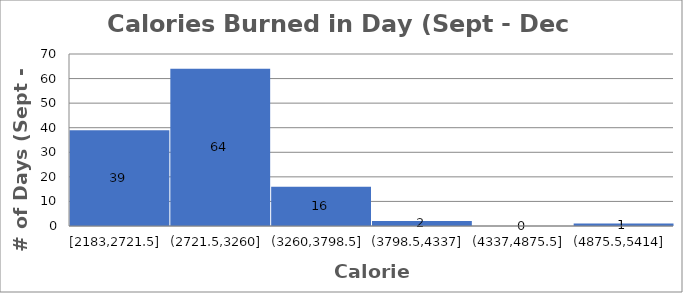
| Category | Sleep Score |
|---|---|
| 9/1/19 | 83 |
| 9/2/19 | 80 |
| 9/3/19 | 76 |
| 9/4/19 | 75 |
| 9/5/19 | 61 |
| 9/6/19 | 84 |
| 9/7/19 | 81 |
| 9/8/19 | 84 |
| 9/9/19 | 78 |
| 9/10/19 | 72 |
| 9/11/19 | 77 |
| 9/12/19 | 70 |
| 9/13/19 | 74 |
| 9/14/19 | 69 |
| 9/15/19 | 56 |
| 9/16/19 | 78 |
| 9/17/19 | 64 |
| 9/18/19 | 72 |
| 9/19/19 | 74 |
| 9/20/19 | 76 |
| 9/21/19 | 81 |
| 9/22/19 | 79 |
| 9/23/19 | 82 |
| 9/24/19 | 79 |
| 9/25/19 | 71 |
| 9/26/19 | 74 |
| 9/27/19 | 68 |
| 9/28/19 | 85 |
| 9/29/19 | 77 |
| 9/30/19 | 81 |
| 10/1/19 | 74 |
| 10/2/19 | 69 |
| 10/3/19 | 77 |
| 10/4/19 | 74 |
| 10/5/19 | 77 |
| 10/6/19 | 79 |
| 10/7/19 | 64 |
| 10/8/19 | 88 |
| 10/9/19 | 81 |
| 10/10/19 | 79 |
| 10/11/19 | 73 |
| 10/12/19 | 73 |
| 10/13/19 | 79 |
| 10/14/19 | 67 |
| 10/15/19 | 79 |
| 10/16/19 | 81 |
| 10/17/19 | 75 |
| 10/18/19 | 64 |
| 10/19/19 | 75 |
| 10/20/19 | 89 |
| 10/21/19 | 76 |
| 10/22/19 | 69 |
| 10/23/19 | 77 |
| 10/24/19 | 79 |
| 10/25/19 | 68 |
| 10/26/19 | 90 |
| 10/27/19 | 82 |
| 10/28/19 | 75 |
| 10/29/19 | 76 |
| 10/30/19 | 74 |
| 10/31/19 | 75 |
| 11/1/19 | 65 |
| 11/2/19 | 86 |
| 11/3/19 | 67 |
| 11/4/19 | 80 |
| 11/5/19 | 76 |
| 11/6/19 | 74 |
| 11/7/19 | 79 |
| 11/8/19 | 78 |
| 11/9/19 | 82 |
| 11/10/19 | 74 |
| 11/11/19 | 85 |
| 11/12/19 | 67 |
| 11/13/19 | 76 |
| 11/14/19 | 80 |
| 11/15/19 | 83 |
| 11/16/19 | 86 |
| 11/17/19 | 82 |
| 11/18/19 | 78 |
| 11/19/19 | 79 |
| 11/20/19 | 71 |
| 11/21/19 | 75 |
| 11/22/19 | 76 |
| 11/23/19 | 79 |
| 11/24/19 | 81 |
| 11/25/19 | 81 |
| 11/26/19 | 75 |
| 11/27/19 | 80 |
| 11/28/19 | 87 |
| 11/29/19 | 76 |
| 11/30/19 | 89 |
| 12/1/19 | 85 |
| 12/2/19 | 81 |
| 12/3/19 | 73 |
| 12/4/19 | 74 |
| 12/5/19 | 73 |
| 12/6/19 | 68 |
| 12/7/19 | 83 |
| 12/8/19 | 85 |
| 12/9/19 | 80 |
| 12/10/19 | 76 |
| 12/11/19 | 75 |
| 12/12/19 | 79 |
| 12/13/19 | 75 |
| 12/14/19 | 88 |
| 12/15/19 | 84 |
| 12/16/19 | 72 |
| 12/17/19 | 76 |
| 12/18/19 | 66 |
| 12/19/19 | 72 |
| 12/20/19 | 78 |
| 12/21/19 | 82 |
| 12/22/19 | 89 |
| 12/23/19 | 77 |
| 12/24/19 | 76 |
| 12/25/19 | 76 |
| 12/26/19 | 81 |
| 12/27/19 | 76 |
| 12/28/19 | 74 |
| 12/29/19 | 57 |
| 12/30/19 | 88 |
| 12/31/19 | 75 |